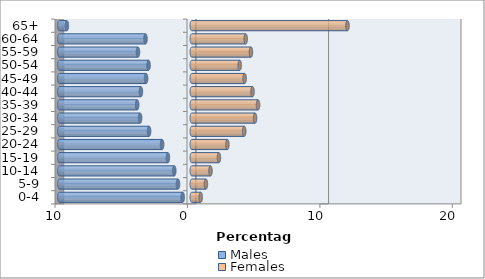
| Category | Males | Females |
|---|---|---|
| 0-4 | -0.686 | 0.673 |
| 5-9 | -1.041 | 1.066 |
| 10-14 | -1.321 | 1.412 |
| 15-19 | -1.804 | 2.05 |
| 20-24 | -2.241 | 2.688 |
| 25-29 | -3.223 | 3.958 |
| 30-34 | -3.901 | 4.779 |
| 35-39 | -4.125 | 5.001 |
| 40-44 | -3.842 | 4.584 |
| 45-49 | -3.449 | 3.99 |
| 50-54 | -3.264 | 3.619 |
| 55-59 | -4.064 | 4.467 |
| 60-64 | -3.493 | 4.071 |
| 65+ | -9.431 | 11.757 |